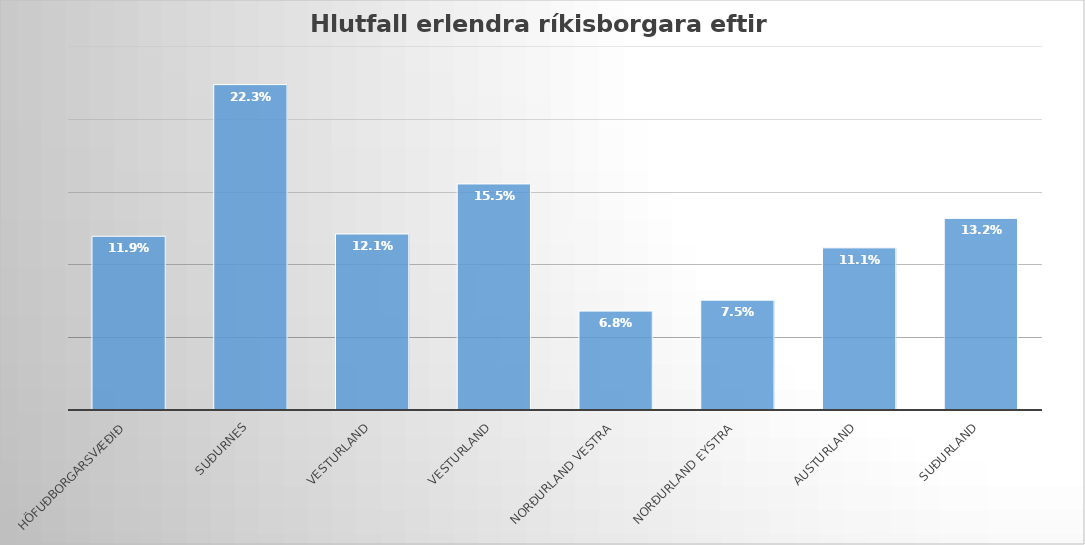
| Category | Hlutfall (%) |
|---|---|
| Höfuðborgarsvæðið | 0.119 |
| Suðurnes | 0.223 |
| Vesturland | 0.121 |
| Vesturland | 0.155 |
| Norðurland vestra | 0.068 |
| Norðurland eystra | 0.075 |
| Austurland | 0.111 |
| Suðurland | 0.132 |